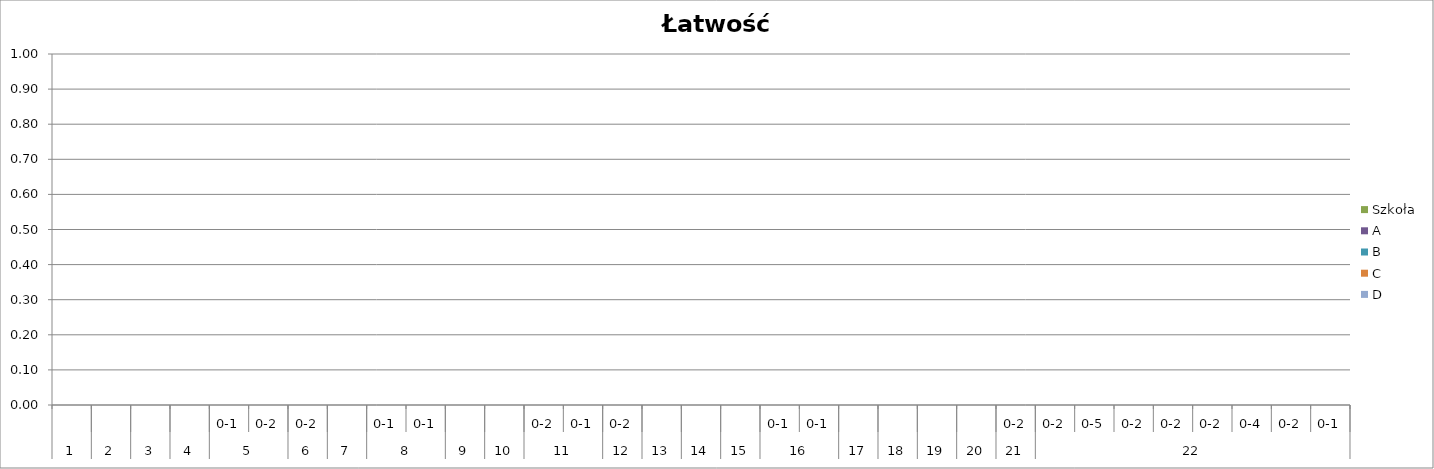
| Category | Szkoła | A | B | C | D |
|---|---|---|---|---|---|
| 0 | 0 | 0 | 0 | 0 | 0 |
| 1 | 0 | 0 | 0 | 0 | 0 |
| 2 | 0 | 0 | 0 | 0 | 0 |
| 3 | 0 | 0 | 0 | 0 | 0 |
| 4 | 0 | 0 | 0 | 0 | 0 |
| 5 | 0 | 0 | 0 | 0 | 0 |
| 6 | 0 | 0 | 0 | 0 | 0 |
| 7 | 0 | 0 | 0 | 0 | 0 |
| 8 | 0 | 0 | 0 | 0 | 0 |
| 9 | 0 | 0 | 0 | 0 | 0 |
| 10 | 0 | 0 | 0 | 0 | 0 |
| 11 | 0 | 0 | 0 | 0 | 0 |
| 12 | 0 | 0 | 0 | 0 | 0 |
| 13 | 0 | 0 | 0 | 0 | 0 |
| 14 | 0 | 0 | 0 | 0 | 0 |
| 15 | 0 | 0 | 0 | 0 | 0 |
| 16 | 0 | 0 | 0 | 0 | 0 |
| 17 | 0 | 0 | 0 | 0 | 0 |
| 18 | 0 | 0 | 0 | 0 | 0 |
| 19 | 0 | 0 | 0 | 0 | 0 |
| 20 | 0 | 0 | 0 | 0 | 0 |
| 21 | 0 | 0 | 0 | 0 | 0 |
| 22 | 0 | 0 | 0 | 0 | 0 |
| 23 | 0 | 0 | 0 | 0 | 0 |
| 24 | 0 | 0 | 0 | 0 | 0 |
| 25 | 0 | 0 | 0 | 0 | 0 |
| 26 | 0 | 0 | 0 | 0 | 0 |
| 27 | 0 | 0 | 0 | 0 | 0 |
| 28 | 0 | 0 | 0 | 0 | 0 |
| 29 | 0 | 0 | 0 | 0 | 0 |
| 30 | 0 | 0 | 0 | 0 | 0 |
| 31 | 0 | 0 | 0 | 0 | 0 |
| 32 | 0 | 0 | 0 | 0 | 0 |